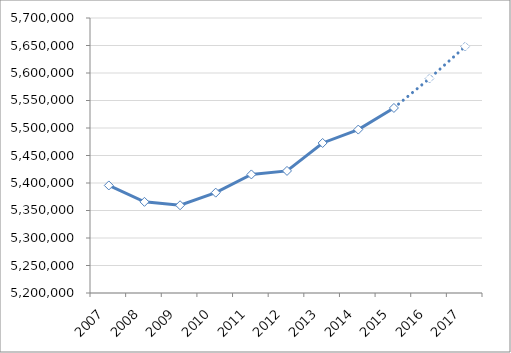
| Category | Total effectifs |
|---|---|
| 2007.0 | 5395548 |
| 2008.0 | 5365725 |
| 2009.0 | 5359527 |
| 2010.0 | 5382470 |
| 2011.0 | 5415587 |
| 2012.0 | 5421987 |
| 2013.0 | 5472782 |
| 2014.0 | 5497135 |
| 2015.0 | 5536422 |
| 2016.0 | 5590038 |
| 2017.0 | 5648100 |